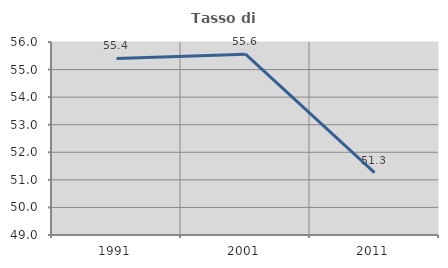
| Category | Tasso di occupazione   |
|---|---|
| 1991.0 | 55.402 |
| 2001.0 | 55.559 |
| 2011.0 | 51.264 |